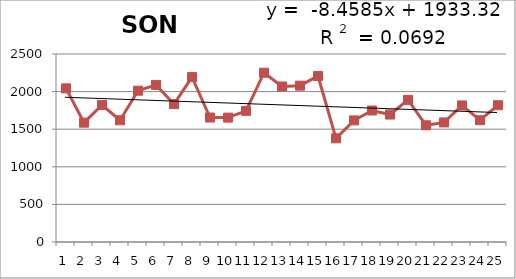
| Category | 1988-2012 |
|---|---|
| 0 | 2043 |
| 1 | 1587 |
| 2 | 1822 |
| 3 | 1619 |
| 4 | 2012 |
| 5 | 2089 |
| 6 | 1834 |
| 7 | 2193 |
| 8 | 1655 |
| 9 | 1654 |
| 10 | 1744 |
| 11 | 2251 |
| 12 | 2068 |
| 13 | 2079 |
| 14 | 2207 |
| 15 | 1379 |
| 16 | 1617 |
| 17 | 1749 |
| 18 | 1695 |
| 19 | 1890 |
| 20 | 1552 |
| 21 | 1590 |
| 22 | 1816 |
| 23 | 1620 |
| 24 | 1819 |